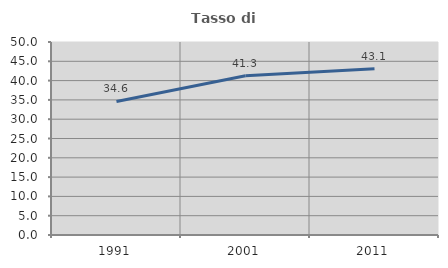
| Category | Tasso di occupazione   |
|---|---|
| 1991.0 | 34.604 |
| 2001.0 | 41.26 |
| 2011.0 | 43.101 |